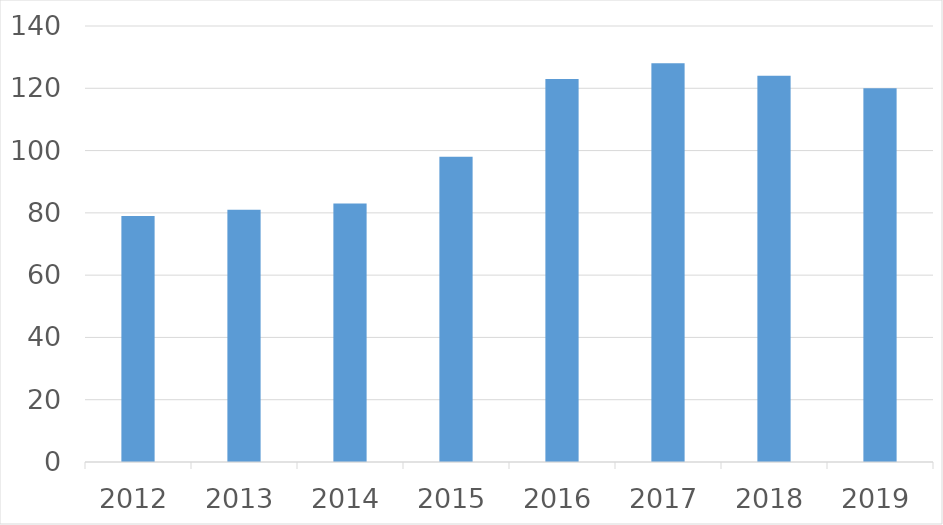
| Category | Series 0 |
|---|---|
| 2012 | 79 |
| 2013 | 81 |
| 2014 | 83 |
| 2015 | 98 |
| 2016 | 123 |
| 2017 | 128 |
| 2018 | 124 |
| 2019 | 120 |